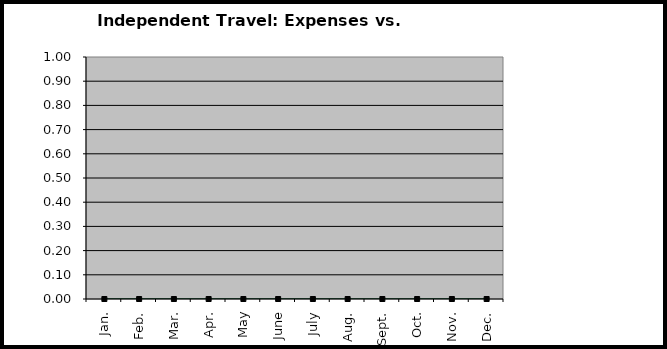
| Category | Expenses | Budgeted |
|---|---|---|
| Jan. | 0 | 0 |
| Feb. | 0 | 0 |
| Mar. | 0 | 0 |
| Apr. | 0 | 0 |
| May | 0 | 0 |
| June | 0 | 0 |
| July | 0 | 0 |
| Aug. | 0 | 0 |
| Sept. | 0 | 0 |
| Oct. | 0 | 0 |
| Nov. | 0 | 0 |
| Dec. | 0 | 0 |